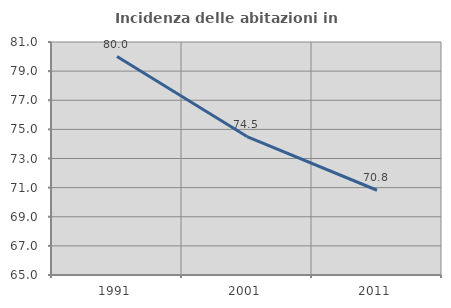
| Category | Incidenza delle abitazioni in proprietà  |
|---|---|
| 1991.0 | 80 |
| 2001.0 | 74.51 |
| 2011.0 | 70.82 |